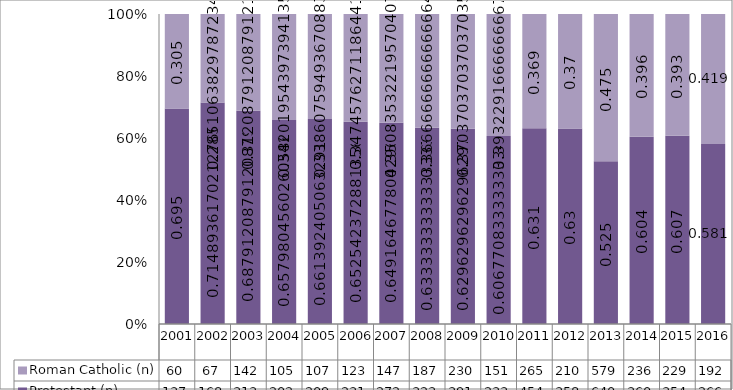
| Category | Protestant (n) | Roman Catholic (n) |
|---|---|---|
| 2001.0 | 137 | 60 |
| 2002.0 | 168 | 67 |
| 2003.0 | 313 | 142 |
| 2004.0 | 202 | 105 |
| 2005.0 | 209 | 107 |
| 2006.0 | 231 | 123 |
| 2007.0 | 272 | 147 |
| 2008.0 | 323 | 187 |
| 2009.0 | 391 | 230 |
| 2010.0 | 233 | 151 |
| 2011.0 | 454 | 265 |
| 2012.0 | 358 | 210 |
| 2013.0 | 640 | 579 |
| 2014.0 | 360 | 236 |
| 2015.0 | 354 | 229 |
| 2016.0 | 266 | 192 |